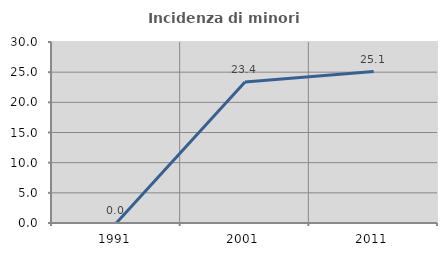
| Category | Incidenza di minori stranieri |
|---|---|
| 1991.0 | 0 |
| 2001.0 | 23.358 |
| 2011.0 | 25.099 |